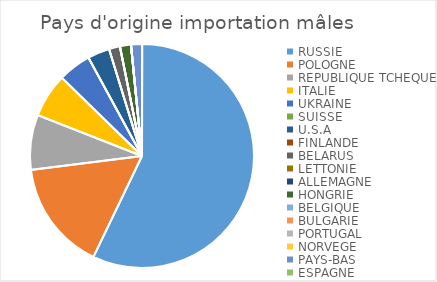
| Category | Series 0 |
|---|---|
| RUSSIE | 36 |
| POLOGNE | 10 |
| REPUBLIQUE TCHEQUE | 5 |
| ITALIE | 4 |
| UKRAINE | 3 |
| SUISSE | 0 |
| U.S.A | 2 |
| FINLANDE | 0 |
| BELARUS | 1 |
| LETTONIE | 0 |
| ALLEMAGNE | 0 |
| HONGRIE | 1 |
| BELGIQUE | 0 |
| BULGARIE | 0 |
| PORTUGAL | 0 |
| NORVEGE | 0 |
| PAYS-BAS | 1 |
| ESPAGNE | 0 |